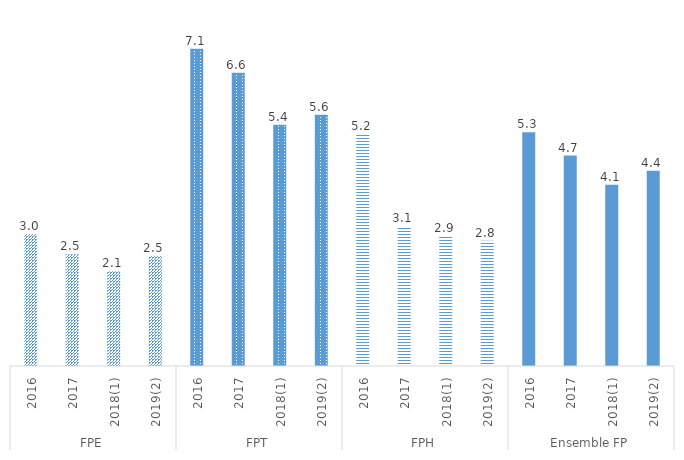
| Category | Apprentis sur travaux dangereux |
|---|---|
| 0 | 2.964 |
| 1 | 2.511 |
| 2 | 2.128 |
| 3 | 2.473 |
| 4 | 7.127 |
| 5 | 6.589 |
| 6 | 5.42 |
| 7 | 5.647 |
| 8 | 5.208 |
| 9 | 3.14 |
| 10 | 2.915 |
| 11 | 2.815 |
| 12 | 5.252 |
| 13 | 4.73 |
| 14 | 4.073 |
| 15 | 4.387 |